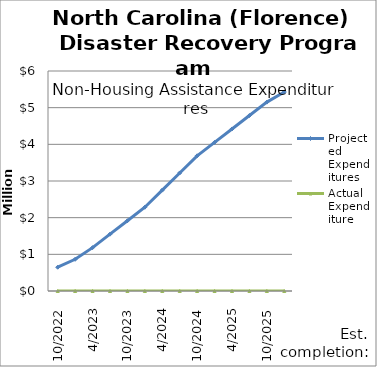
| Category | Projected Expenditures | Actual Expenditure |
|---|---|---|
| 10/2022 | 648527.04 | 0 |
| 1/2023 | 864702.72 | 0 |
| 4/2023 | 1182209.28 | 0 |
| 7/2023 | 1549669.6 | 0 |
| 10/2023 | 1917129.92 | 0 |
| 1/2024 | 2284590.24 | 0 |
| 4/2024 | 2752050.56 | 0 |
| 7/2024 | 3219510.88 | 0 |
| 10/2024 | 3686971.2 | 0 |
| 1/2025 | 4053099.52 | 0 |
| 4/2025 | 4419227.84 | 0 |
| 7/2025 | 4785356.16 | 0 |
| 10/2025 | 5151484.48 | 0 |
| 1/2026 | 5426439.8 | 0 |